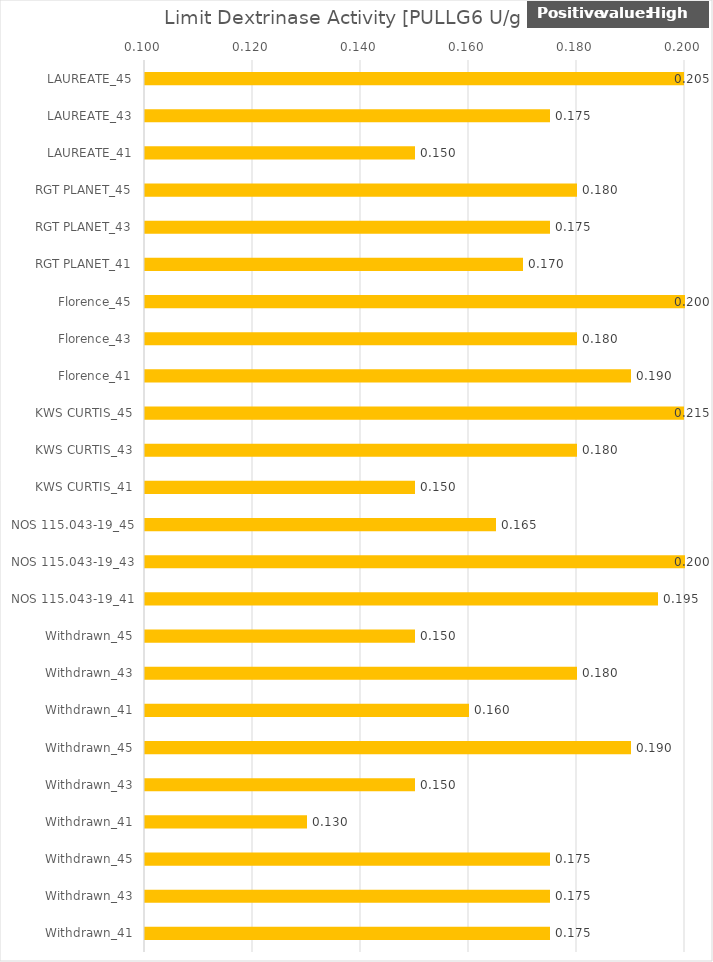
| Category |   Limit Dextrinase Activity [PULLG6 U/g dm] |
|---|---|
| LAUREATE_45 | 0.205 |
| LAUREATE_43 | 0.175 |
| LAUREATE_41 | 0.15 |
| RGT PLANET_45 | 0.18 |
| RGT PLANET_43 | 0.175 |
| RGT PLANET_41 | 0.17 |
| Florence_45 | 0.2 |
| Florence_43 | 0.18 |
| Florence_41 | 0.19 |
| KWS CURTIS_45 | 0.215 |
| KWS CURTIS_43 | 0.18 |
| KWS CURTIS_41 | 0.15 |
| NOS 115.043-19_45 | 0.165 |
| NOS 115.043-19_43 | 0.2 |
| NOS 115.043-19_41 | 0.195 |
| Withdrawn_45 | 0.15 |
| Withdrawn_43 | 0.18 |
| Withdrawn_41 | 0.16 |
| Withdrawn_45 | 0.19 |
| Withdrawn_43 | 0.15 |
| Withdrawn_41 | 0.13 |
| Withdrawn_45 | 0.175 |
| Withdrawn_43 | 0.175 |
| Withdrawn_41 | 0.175 |